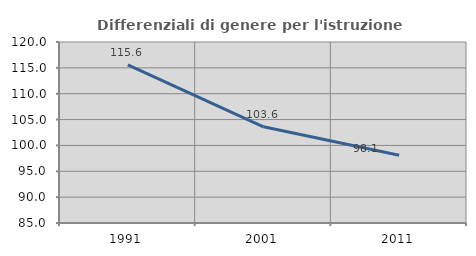
| Category | Differenziali di genere per l'istruzione superiore |
|---|---|
| 1991.0 | 115.596 |
| 2001.0 | 103.605 |
| 2011.0 | 98.095 |